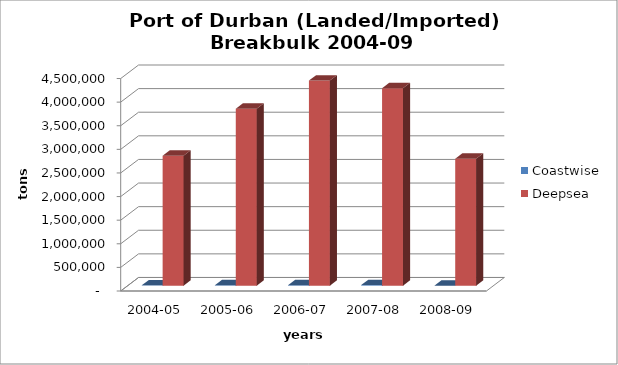
| Category | Coastwise | Deepsea |
|---|---|---|
| 2004-05 | 7270 | 2754177 |
| 2005-06 | 9518 | 3747132 |
| 2006-07 | 10552 | 4344867 |
| 2007-08 | 13267 | 4181461 |
| 2008-09 | 288 | 2689769 |